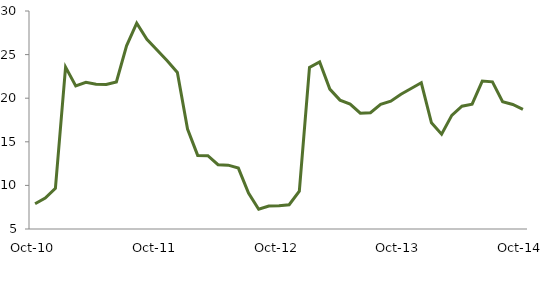
| Category | Series 0 |
|---|---|
| Oct-10 | 7.895 |
|  | 8.557 |
|  | 9.672 |
|  | 23.568 |
|  | 21.416 |
|  | 21.82 |
|  | 21.594 |
|  | 21.573 |
|  | 21.858 |
|  | 26.004 |
|  | 28.598 |
|  | 26.763 |
| Oct-11 | 25.524 |
|  | 24.297 |
|  | 22.953 |
|  | 16.468 |
|  | 13.439 |
|  | 13.403 |
|  | 12.375 |
|  | 12.322 |
|  | 11.984 |
|  | 9.127 |
|  | 7.263 |
|  | 7.639 |
| Oct-12 | 7.67 |
|  | 7.782 |
|  | 9.348 |
|  | 23.527 |
|  | 24.167 |
|  | 21.04 |
|  | 19.779 |
|  | 19.32 |
|  | 18.279 |
|  | 18.336 |
|  | 19.291 |
|  | 19.663 |
| Oct-13 | 20.461 |
|  | 21.118 |
|  | 21.766 |
|  | 17.185 |
|  | 15.873 |
|  | 18.029 |
|  | 19.087 |
|  | 19.316 |
|  | 21.967 |
|  | 21.875 |
|  | 19.587 |
|  | 19.284 |
| Oct-14 | 18.73 |